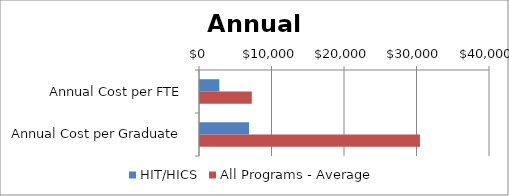
| Category | HIT/HICS | All Programs - Average |
|---|---|---|
| Annual Cost per FTE | 2672.239 | 7144 |
| Annual Cost per Graduate | 6759.193 | 30340 |